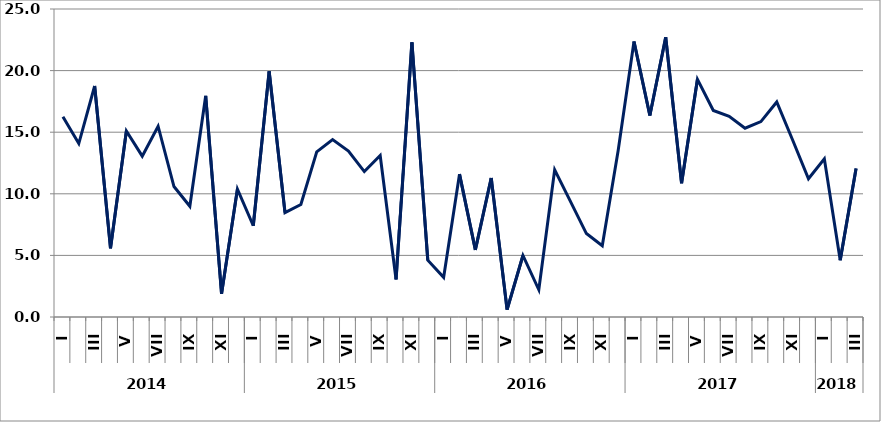
| Category | დღგ-ს  გადამხდელ  საწარმოთა  ბრუნვის ცვლილება (%) |
|---|---|
| 0 | 16.26 |
| 1 | 14.081 |
| 2 | 18.749 |
| 3 | 5.578 |
| 4 | 15.095 |
| 5 | 13.057 |
| 6 | 15.484 |
| 7 | 10.592 |
| 8 | 8.989 |
| 9 | 17.953 |
| 10 | 1.884 |
| 11 | 10.38 |
| 12 | 7.405 |
| 13 | 19.944 |
| 14 | 8.466 |
| 15 | 9.132 |
| 16 | 13.408 |
| 17 | 14.407 |
| 18 | 13.472 |
| 19 | 11.803 |
| 20 | 13.113 |
| 21 | 3.049 |
| 22 | 22.285 |
| 23 | 4.614 |
| 24 | 3.216 |
| 25 | 11.594 |
| 26 | 5.449 |
| 27 | 11.283 |
| 28 | 0.603 |
| 29 | 4.993 |
| 30 | 2.209 |
| 31 | 11.948 |
| 32 | 9.361 |
| 33 | 6.774 |
| 34 | 5.784 |
| 35 | 13.489 |
| 36 | 22.36 |
| 37 | 16.358 |
| 38 | 22.704 |
| 39 | 10.854 |
| 40 | 19.299 |
| 41 | 16.761 |
| 42 | 16.295 |
| 43 | 15.325 |
| 44 | 15.858 |
| 45 | 17.453 |
| 46 | 14.37 |
| 47 | 11.219 |
| 48 | 12.839 |
| 49 | 4.612 |
| 50 | 12.056 |